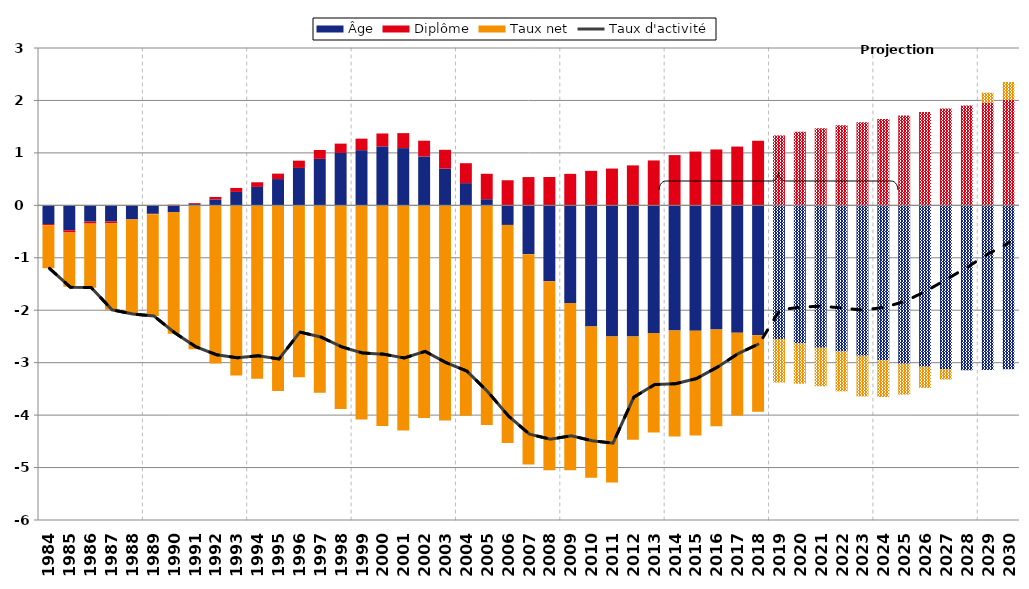
| Category | Âge | Diplôme | Taux net |
|---|---|---|---|
| 1984.0 | -0.357 | -0.025 | -0.817 |
| 1985.0 | -0.475 | -0.043 | -1.033 |
| 1986.0 | -0.31 | -0.038 | -1.223 |
| 1987.0 | -0.306 | -0.037 | -1.647 |
| 1988.0 | -0.265 | -0.005 | -1.809 |
| 1989.0 | -0.161 | -0.007 | -1.944 |
| 1990.0 | -0.134 | 0.012 | -2.314 |
| 1991.0 | 0.023 | 0.018 | -2.744 |
| 1992.0 | 0.113 | 0.047 | -3.016 |
| 1993.0 | 0.256 | 0.076 | -3.243 |
| 1994.0 | 0.351 | 0.088 | -3.306 |
| 1995.0 | 0.501 | 0.104 | -3.54 |
| 1996.0 | 0.713 | 0.139 | -3.278 |
| 1997.0 | 0.886 | 0.169 | -3.576 |
| 1998.0 | 0.999 | 0.178 | -3.883 |
| 1999.0 | 1.052 | 0.219 | -4.083 |
| 2000.0 | 1.124 | 0.246 | -4.207 |
| 2001.0 | 1.091 | 0.285 | -4.294 |
| 2002.0 | 0.931 | 0.301 | -4.053 |
| 2003.0 | 0.7 | 0.359 | -4.102 |
| 2004.0 | 0.423 | 0.38 | -4.013 |
| 2005.0 | 0.117 | 0.485 | -4.189 |
| 2006.0 | -0.373 | 0.478 | -4.16 |
| 2007.0 | -0.931 | 0.539 | -4.012 |
| 2008.0 | -1.447 | 0.541 | -3.604 |
| 2009.0 | -1.864 | 0.6 | -3.186 |
| 2010.0 | -2.309 | 0.658 | -2.884 |
| 2011.0 | -2.503 | 0.701 | -2.782 |
| 2012.0 | -2.503 | 0.762 | -1.968 |
| 2013.0 | -2.435 | 0.856 | -1.895 |
| 2014.0 | -2.387 | 0.958 | -2.022 |
| 2015.0 | -2.393 | 1.025 | -1.997 |
| 2016.0 | -2.367 | 1.065 | -1.845 |
| 2017.0 | -2.431 | 1.121 | -1.577 |
| 2018.0 | -2.476 | 1.232 | -1.46 |
| 2019.0 | -2.548 | 1.333 | -0.831 |
| 2020.0 | -2.633 | 1.403 | -0.768 |
| 2021.0 | -2.716 | 1.469 | -0.734 |
| 2022.0 | -2.787 | 1.527 | -0.759 |
| 2023.0 | -2.867 | 1.584 | -0.777 |
| 2024.0 | -2.954 | 1.648 | -0.702 |
| 2025.0 | -3.021 | 1.712 | -0.588 |
| 2026.0 | -3.076 | 1.779 | -0.405 |
| 2027.0 | -3.123 | 1.845 | -0.199 |
| 2028.0 | -3.144 | 1.905 | -0.003 |
| 2029.0 | -3.138 | 1.96 | 0.188 |
| 2030.0 | -3.126 | 2.008 | 0.345 |